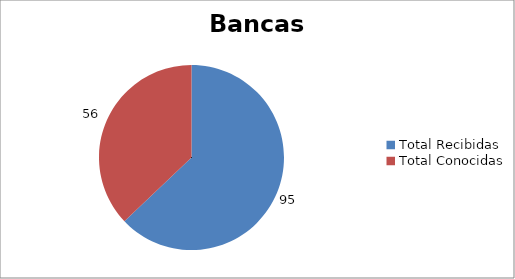
| Category | Series 0 |
|---|---|
| Total Recibidas | 95 |
| Total Conocidas | 56 |